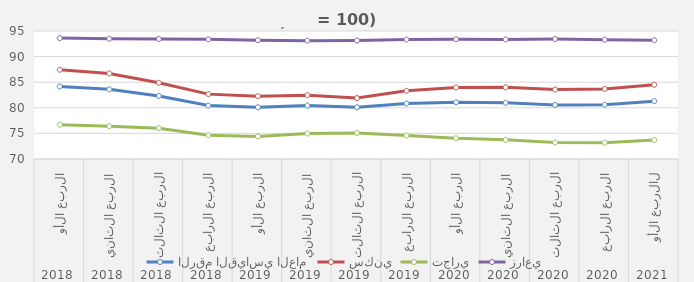
| Category | الرقم القياسي العام | سكني | تجاري | زراعي |
|---|---|---|---|---|
| 0 | 84.16 | 87.43 | 76.7 | 93.61 |
| 1 | 83.603 | 86.713 | 76.403 | 93.5 |
| 2 | 82.31 | 84.883 | 76.01 | 93.45 |
| 3 | 80.443 | 82.67 | 74.65 | 93.37 |
| 4 | 80.11 | 82.277 | 74.417 | 93.203 |
| 5 | 80.427 | 82.473 | 74.983 | 93.11 |
| 6 | 80.093 | 81.9 | 75.083 | 93.14 |
| 7 | 80.833 | 83.32 | 74.577 | 93.33 |
| 8 | 81.07 | 83.973 | 74.047 | 93.397 |
| 9 | 80.977 | 83.99 | 73.74 | 93.353 |
| 10 | 80.538 | 83.562 | 73.242 | 93.424 |
| 11 | 80.6 | 83.696 | 73.187 | 93.307 |
| 12 | 81.3 | 84.5 | 73.7 | 93.2 |